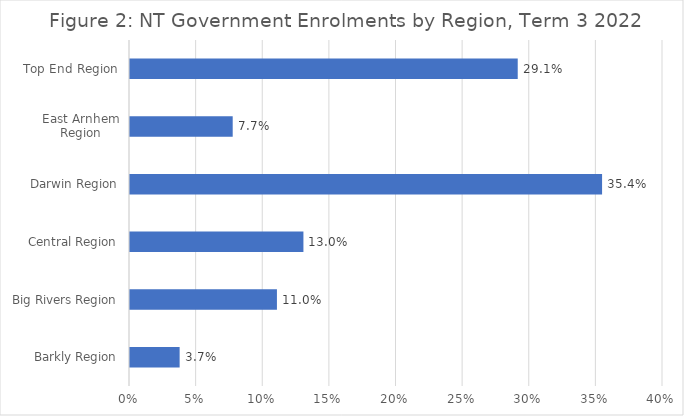
| Category | Series 0 |
|---|---|
| Barkly Region | 0.037 |
| Big Rivers Region | 0.11 |
| Central Region | 0.13 |
| Darwin Region | 0.354 |
| East Arnhem Region | 0.077 |
| Top End Region | 0.291 |